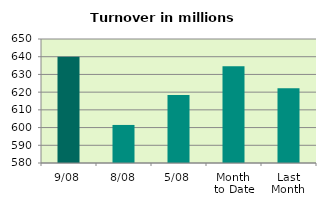
| Category | Series 0 |
|---|---|
| 9/08 | 639.953 |
| 8/08 | 601.482 |
| 5/08 | 618.343 |
| Month 
to Date | 634.579 |
| Last
Month | 622.259 |